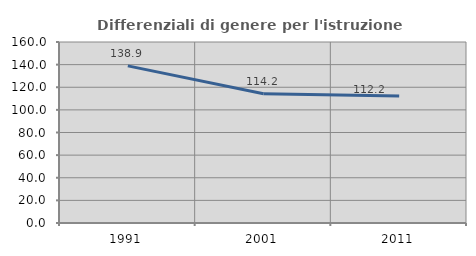
| Category | Differenziali di genere per l'istruzione superiore |
|---|---|
| 1991.0 | 138.898 |
| 2001.0 | 114.19 |
| 2011.0 | 112.203 |